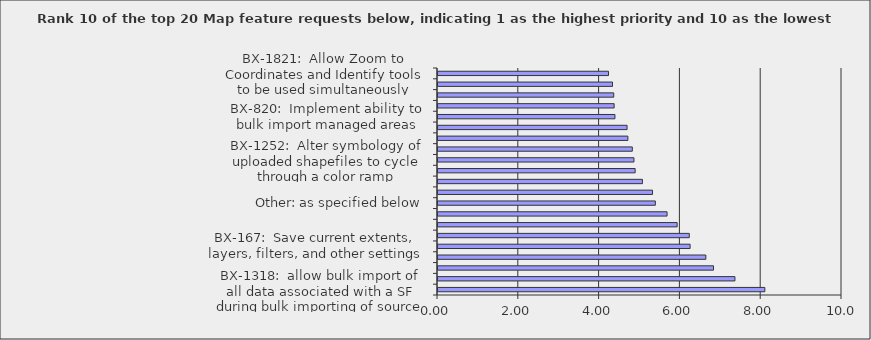
| Category | Series 0 |
|---|---|
| BX-1318:  allow bulk import of all data associated with a SF during bulk importing of source features | 8.09 |
| BX-822:  Implement ability to create EOs from bulk imported SFs | 7.35 |
| BX-1303:  increase ArcGIS Server limit for records returned from spatial search | 6.82 |
| BX-1370:  Customize attributes displayed in Identify/Feature Search/Filter tools and exported shapefiles using Join Fields | 6.63 |
| BX-167:  Save current extents, layers, filters, and other settings | 6.24 |
| BX-1346:  Implement ability to uploaded shapefile and link records to unmapped Managed Area/Site records | 6.22 |
| BX-1149:  Export to Shapefile - All layers | 5.92 |
| BX-676:  Implement ability to batch import SF shapes & link to existing unmapped SF data records (Link Source Features) | 5.67 |
| Other: as specified below | 5.38 |
| BX-90:  Add Zoom By tool or ability to configure Find Location tool | 5.31 |
| BX-294:  Allow users to add graphics to the map | 5.06 |
| BX-172:  Allow individual users to change symbology for managed layers and also other map services that would support this behavior | 4.88 |
| BX-1252:  Alter symbology of uploaded shapefiles to cycle through a color ramp | 4.85 |
| BX-1192:  file geodatabase export from B5 | 4.81 |
| BX-1228:  Increase limits imposed on Feature Search and Filter by Working List by ArcGIS Server setting | 4.7 |
| BX-156:  Implement ability to save and apply saved filters to Map Resources | 4.68 |
| BX-820:  Implement ability to bulk import managed areas | 4.38 |
| BX-402:  Implement the ability for users to create, manage, and use geographic bookmarks | 4.36 |
| BX-972:  improve measure tool | 4.35 |
| BX-1297:  Create Working List from filtered layer | 4.32 |
| BX-1821:  Allow Zoom to Coordinates and Identify tools to be used simultaneously (previously supported) | 4.22 |